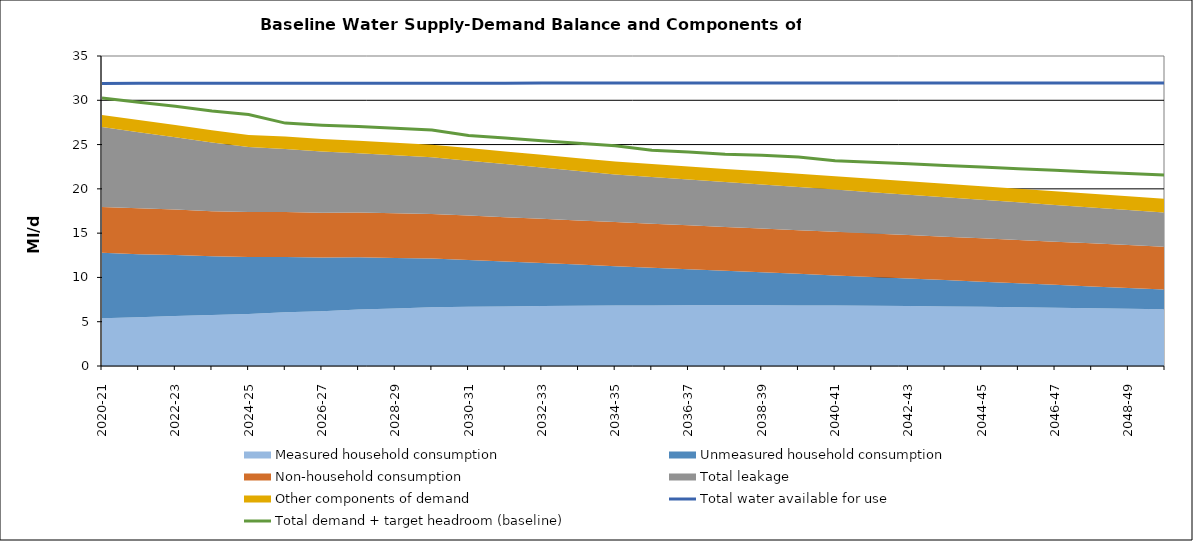
| Category | Total water available for use | Total demand + target headroom (baseline) |
|---|---|---|
| 0 | 31.907 | 30.271 |
| 1 | 31.91 | 29.786 |
| 2 | 31.913 | 29.324 |
| 3 | 31.916 | 28.778 |
| 4 | 31.919 | 28.395 |
| 5 | 31.922 | 27.423 |
| 6 | 31.925 | 27.187 |
| 7 | 31.928 | 27.041 |
| 8 | 31.931 | 26.84 |
| 9 | 31.934 | 26.657 |
| 10 | 31.936 | 26.037 |
| 11 | 31.937 | 25.754 |
| 12 | 31.938 | 25.439 |
| 13 | 31.939 | 25.153 |
| 14 | 31.94 | 24.874 |
| 15 | 31.94 | 24.353 |
| 16 | 31.941 | 24.167 |
| 17 | 31.942 | 23.92 |
| 18 | 31.943 | 23.785 |
| 19 | 31.943 | 23.604 |
| 20 | 31.944 | 23.186 |
| 21 | 31.945 | 23.004 |
| 22 | 31.946 | 22.823 |
| 23 | 31.946 | 22.651 |
| 24 | 31.947 | 22.47 |
| 25 | 31.948 | 22.282 |
| 26 | 31.949 | 22.112 |
| 27 | 31.95 | 21.916 |
| 28 | 31.95 | 21.746 |
| 29 | 31.951 | 21.566 |